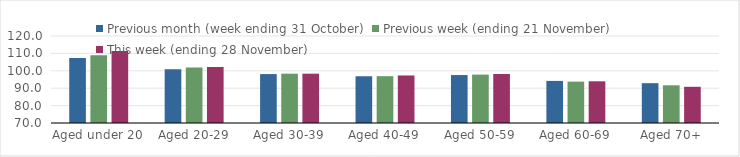
| Category | Previous month (week ending 31 October) | Previous week (ending 21 November) | This week (ending 28 November) |
|---|---|---|---|
| Aged under 20 | 107.36 | 108.97 | 111.45 |
| Aged 20-29 | 100.96 | 101.83 | 102.2 |
| Aged 30-39 | 98.11 | 98.35 | 98.34 |
| Aged 40-49 | 96.87 | 96.91 | 97.32 |
| Aged 50-59 | 97.55 | 97.81 | 98.17 |
| Aged 60-69 | 94.19 | 93.79 | 93.97 |
| Aged 70+ | 92.88 | 91.67 | 90.81 |